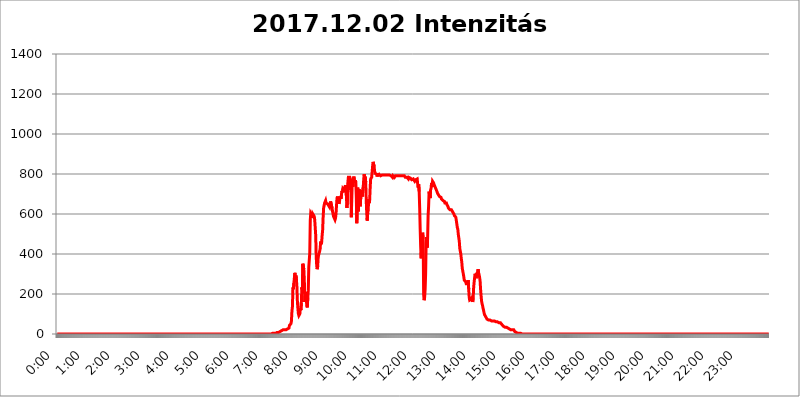
| Category | 2017.12.02 Intenzitás [W/m^2] |
|---|---|
| 0.0 | 0 |
| 0.0006944444444444445 | 0 |
| 0.001388888888888889 | 0 |
| 0.0020833333333333333 | 0 |
| 0.002777777777777778 | 0 |
| 0.003472222222222222 | 0 |
| 0.004166666666666667 | 0 |
| 0.004861111111111111 | 0 |
| 0.005555555555555556 | 0 |
| 0.0062499999999999995 | 0 |
| 0.006944444444444444 | 0 |
| 0.007638888888888889 | 0 |
| 0.008333333333333333 | 0 |
| 0.009027777777777779 | 0 |
| 0.009722222222222222 | 0 |
| 0.010416666666666666 | 0 |
| 0.011111111111111112 | 0 |
| 0.011805555555555555 | 0 |
| 0.012499999999999999 | 0 |
| 0.013194444444444444 | 0 |
| 0.013888888888888888 | 0 |
| 0.014583333333333332 | 0 |
| 0.015277777777777777 | 0 |
| 0.015972222222222224 | 0 |
| 0.016666666666666666 | 0 |
| 0.017361111111111112 | 0 |
| 0.018055555555555557 | 0 |
| 0.01875 | 0 |
| 0.019444444444444445 | 0 |
| 0.02013888888888889 | 0 |
| 0.020833333333333332 | 0 |
| 0.02152777777777778 | 0 |
| 0.022222222222222223 | 0 |
| 0.02291666666666667 | 0 |
| 0.02361111111111111 | 0 |
| 0.024305555555555556 | 0 |
| 0.024999999999999998 | 0 |
| 0.025694444444444447 | 0 |
| 0.02638888888888889 | 0 |
| 0.027083333333333334 | 0 |
| 0.027777777777777776 | 0 |
| 0.02847222222222222 | 0 |
| 0.029166666666666664 | 0 |
| 0.029861111111111113 | 0 |
| 0.030555555555555555 | 0 |
| 0.03125 | 0 |
| 0.03194444444444445 | 0 |
| 0.03263888888888889 | 0 |
| 0.03333333333333333 | 0 |
| 0.034027777777777775 | 0 |
| 0.034722222222222224 | 0 |
| 0.035416666666666666 | 0 |
| 0.036111111111111115 | 0 |
| 0.03680555555555556 | 0 |
| 0.0375 | 0 |
| 0.03819444444444444 | 0 |
| 0.03888888888888889 | 0 |
| 0.03958333333333333 | 0 |
| 0.04027777777777778 | 0 |
| 0.04097222222222222 | 0 |
| 0.041666666666666664 | 0 |
| 0.042361111111111106 | 0 |
| 0.04305555555555556 | 0 |
| 0.043750000000000004 | 0 |
| 0.044444444444444446 | 0 |
| 0.04513888888888889 | 0 |
| 0.04583333333333334 | 0 |
| 0.04652777777777778 | 0 |
| 0.04722222222222222 | 0 |
| 0.04791666666666666 | 0 |
| 0.04861111111111111 | 0 |
| 0.049305555555555554 | 0 |
| 0.049999999999999996 | 0 |
| 0.05069444444444445 | 0 |
| 0.051388888888888894 | 0 |
| 0.052083333333333336 | 0 |
| 0.05277777777777778 | 0 |
| 0.05347222222222222 | 0 |
| 0.05416666666666667 | 0 |
| 0.05486111111111111 | 0 |
| 0.05555555555555555 | 0 |
| 0.05625 | 0 |
| 0.05694444444444444 | 0 |
| 0.057638888888888885 | 0 |
| 0.05833333333333333 | 0 |
| 0.05902777777777778 | 0 |
| 0.059722222222222225 | 0 |
| 0.06041666666666667 | 0 |
| 0.061111111111111116 | 0 |
| 0.06180555555555556 | 0 |
| 0.0625 | 0 |
| 0.06319444444444444 | 0 |
| 0.06388888888888888 | 0 |
| 0.06458333333333334 | 0 |
| 0.06527777777777778 | 0 |
| 0.06597222222222222 | 0 |
| 0.06666666666666667 | 0 |
| 0.06736111111111111 | 0 |
| 0.06805555555555555 | 0 |
| 0.06874999999999999 | 0 |
| 0.06944444444444443 | 0 |
| 0.07013888888888889 | 0 |
| 0.07083333333333333 | 0 |
| 0.07152777777777779 | 0 |
| 0.07222222222222223 | 0 |
| 0.07291666666666667 | 0 |
| 0.07361111111111111 | 0 |
| 0.07430555555555556 | 0 |
| 0.075 | 0 |
| 0.07569444444444444 | 0 |
| 0.0763888888888889 | 0 |
| 0.07708333333333334 | 0 |
| 0.07777777777777778 | 0 |
| 0.07847222222222222 | 0 |
| 0.07916666666666666 | 0 |
| 0.0798611111111111 | 0 |
| 0.08055555555555556 | 0 |
| 0.08125 | 0 |
| 0.08194444444444444 | 0 |
| 0.08263888888888889 | 0 |
| 0.08333333333333333 | 0 |
| 0.08402777777777777 | 0 |
| 0.08472222222222221 | 0 |
| 0.08541666666666665 | 0 |
| 0.08611111111111112 | 0 |
| 0.08680555555555557 | 0 |
| 0.08750000000000001 | 0 |
| 0.08819444444444445 | 0 |
| 0.08888888888888889 | 0 |
| 0.08958333333333333 | 0 |
| 0.09027777777777778 | 0 |
| 0.09097222222222222 | 0 |
| 0.09166666666666667 | 0 |
| 0.09236111111111112 | 0 |
| 0.09305555555555556 | 0 |
| 0.09375 | 0 |
| 0.09444444444444444 | 0 |
| 0.09513888888888888 | 0 |
| 0.09583333333333333 | 0 |
| 0.09652777777777777 | 0 |
| 0.09722222222222222 | 0 |
| 0.09791666666666667 | 0 |
| 0.09861111111111111 | 0 |
| 0.09930555555555555 | 0 |
| 0.09999999999999999 | 0 |
| 0.10069444444444443 | 0 |
| 0.1013888888888889 | 0 |
| 0.10208333333333335 | 0 |
| 0.10277777777777779 | 0 |
| 0.10347222222222223 | 0 |
| 0.10416666666666667 | 0 |
| 0.10486111111111111 | 0 |
| 0.10555555555555556 | 0 |
| 0.10625 | 0 |
| 0.10694444444444444 | 0 |
| 0.1076388888888889 | 0 |
| 0.10833333333333334 | 0 |
| 0.10902777777777778 | 0 |
| 0.10972222222222222 | 0 |
| 0.1111111111111111 | 0 |
| 0.11180555555555556 | 0 |
| 0.11180555555555556 | 0 |
| 0.1125 | 0 |
| 0.11319444444444444 | 0 |
| 0.11388888888888889 | 0 |
| 0.11458333333333333 | 0 |
| 0.11527777777777777 | 0 |
| 0.11597222222222221 | 0 |
| 0.11666666666666665 | 0 |
| 0.1173611111111111 | 0 |
| 0.11805555555555557 | 0 |
| 0.11944444444444445 | 0 |
| 0.12013888888888889 | 0 |
| 0.12083333333333333 | 0 |
| 0.12152777777777778 | 0 |
| 0.12222222222222223 | 0 |
| 0.12291666666666667 | 0 |
| 0.12291666666666667 | 0 |
| 0.12361111111111112 | 0 |
| 0.12430555555555556 | 0 |
| 0.125 | 0 |
| 0.12569444444444444 | 0 |
| 0.12638888888888888 | 0 |
| 0.12708333333333333 | 0 |
| 0.16875 | 0 |
| 0.12847222222222224 | 0 |
| 0.12916666666666668 | 0 |
| 0.12986111111111112 | 0 |
| 0.13055555555555556 | 0 |
| 0.13125 | 0 |
| 0.13194444444444445 | 0 |
| 0.1326388888888889 | 0 |
| 0.13333333333333333 | 0 |
| 0.13402777777777777 | 0 |
| 0.13402777777777777 | 0 |
| 0.13472222222222222 | 0 |
| 0.13541666666666666 | 0 |
| 0.1361111111111111 | 0 |
| 0.13749999999999998 | 0 |
| 0.13819444444444443 | 0 |
| 0.1388888888888889 | 0 |
| 0.13958333333333334 | 0 |
| 0.14027777777777778 | 0 |
| 0.14097222222222222 | 0 |
| 0.14166666666666666 | 0 |
| 0.1423611111111111 | 0 |
| 0.14305555555555557 | 0 |
| 0.14375000000000002 | 0 |
| 0.14444444444444446 | 0 |
| 0.1451388888888889 | 0 |
| 0.1451388888888889 | 0 |
| 0.14652777777777778 | 0 |
| 0.14722222222222223 | 0 |
| 0.14791666666666667 | 0 |
| 0.1486111111111111 | 0 |
| 0.14930555555555555 | 0 |
| 0.15 | 0 |
| 0.15069444444444444 | 0 |
| 0.15138888888888888 | 0 |
| 0.15208333333333332 | 0 |
| 0.15277777777777776 | 0 |
| 0.15347222222222223 | 0 |
| 0.15416666666666667 | 0 |
| 0.15486111111111112 | 0 |
| 0.15555555555555556 | 0 |
| 0.15625 | 0 |
| 0.15694444444444444 | 0 |
| 0.15763888888888888 | 0 |
| 0.15833333333333333 | 0 |
| 0.15902777777777777 | 0 |
| 0.15972222222222224 | 0 |
| 0.16041666666666668 | 0 |
| 0.16111111111111112 | 0 |
| 0.16180555555555556 | 0 |
| 0.1625 | 0 |
| 0.16319444444444445 | 0 |
| 0.1638888888888889 | 0 |
| 0.16458333333333333 | 0 |
| 0.16527777777777777 | 0 |
| 0.16597222222222222 | 0 |
| 0.16666666666666666 | 0 |
| 0.1673611111111111 | 0 |
| 0.16805555555555554 | 0 |
| 0.16874999999999998 | 0 |
| 0.16944444444444443 | 0 |
| 0.17013888888888887 | 0 |
| 0.1708333333333333 | 0 |
| 0.17152777777777775 | 0 |
| 0.17222222222222225 | 0 |
| 0.1729166666666667 | 0 |
| 0.17361111111111113 | 0 |
| 0.17430555555555557 | 0 |
| 0.17500000000000002 | 0 |
| 0.17569444444444446 | 0 |
| 0.1763888888888889 | 0 |
| 0.17708333333333334 | 0 |
| 0.17777777777777778 | 0 |
| 0.17847222222222223 | 0 |
| 0.17916666666666667 | 0 |
| 0.1798611111111111 | 0 |
| 0.18055555555555555 | 0 |
| 0.18125 | 0 |
| 0.18194444444444444 | 0 |
| 0.1826388888888889 | 0 |
| 0.18333333333333335 | 0 |
| 0.1840277777777778 | 0 |
| 0.18472222222222223 | 0 |
| 0.18541666666666667 | 0 |
| 0.18611111111111112 | 0 |
| 0.18680555555555556 | 0 |
| 0.1875 | 0 |
| 0.18819444444444444 | 0 |
| 0.18888888888888888 | 0 |
| 0.18958333333333333 | 0 |
| 0.19027777777777777 | 0 |
| 0.1909722222222222 | 0 |
| 0.19166666666666665 | 0 |
| 0.19236111111111112 | 0 |
| 0.19305555555555554 | 0 |
| 0.19375 | 0 |
| 0.19444444444444445 | 0 |
| 0.1951388888888889 | 0 |
| 0.19583333333333333 | 0 |
| 0.19652777777777777 | 0 |
| 0.19722222222222222 | 0 |
| 0.19791666666666666 | 0 |
| 0.1986111111111111 | 0 |
| 0.19930555555555554 | 0 |
| 0.19999999999999998 | 0 |
| 0.20069444444444443 | 0 |
| 0.20138888888888887 | 0 |
| 0.2020833333333333 | 0 |
| 0.2027777777777778 | 0 |
| 0.2034722222222222 | 0 |
| 0.2041666666666667 | 0 |
| 0.20486111111111113 | 0 |
| 0.20555555555555557 | 0 |
| 0.20625000000000002 | 0 |
| 0.20694444444444446 | 0 |
| 0.2076388888888889 | 0 |
| 0.20833333333333334 | 0 |
| 0.20902777777777778 | 0 |
| 0.20972222222222223 | 0 |
| 0.21041666666666667 | 0 |
| 0.2111111111111111 | 0 |
| 0.21180555555555555 | 0 |
| 0.2125 | 0 |
| 0.21319444444444444 | 0 |
| 0.2138888888888889 | 0 |
| 0.21458333333333335 | 0 |
| 0.2152777777777778 | 0 |
| 0.21597222222222223 | 0 |
| 0.21666666666666667 | 0 |
| 0.21736111111111112 | 0 |
| 0.21805555555555556 | 0 |
| 0.21875 | 0 |
| 0.21944444444444444 | 0 |
| 0.22013888888888888 | 0 |
| 0.22083333333333333 | 0 |
| 0.22152777777777777 | 0 |
| 0.2222222222222222 | 0 |
| 0.22291666666666665 | 0 |
| 0.2236111111111111 | 0 |
| 0.22430555555555556 | 0 |
| 0.225 | 0 |
| 0.22569444444444445 | 0 |
| 0.2263888888888889 | 0 |
| 0.22708333333333333 | 0 |
| 0.22777777777777777 | 0 |
| 0.22847222222222222 | 0 |
| 0.22916666666666666 | 0 |
| 0.2298611111111111 | 0 |
| 0.23055555555555554 | 0 |
| 0.23124999999999998 | 0 |
| 0.23194444444444443 | 0 |
| 0.23263888888888887 | 0 |
| 0.2333333333333333 | 0 |
| 0.2340277777777778 | 0 |
| 0.2347222222222222 | 0 |
| 0.2354166666666667 | 0 |
| 0.23611111111111113 | 0 |
| 0.23680555555555557 | 0 |
| 0.23750000000000002 | 0 |
| 0.23819444444444446 | 0 |
| 0.2388888888888889 | 0 |
| 0.23958333333333334 | 0 |
| 0.24027777777777778 | 0 |
| 0.24097222222222223 | 0 |
| 0.24166666666666667 | 0 |
| 0.2423611111111111 | 0 |
| 0.24305555555555555 | 0 |
| 0.24375 | 0 |
| 0.24444444444444446 | 0 |
| 0.24513888888888888 | 0 |
| 0.24583333333333335 | 0 |
| 0.2465277777777778 | 0 |
| 0.24722222222222223 | 0 |
| 0.24791666666666667 | 0 |
| 0.24861111111111112 | 0 |
| 0.24930555555555556 | 0 |
| 0.25 | 0 |
| 0.25069444444444444 | 0 |
| 0.2513888888888889 | 0 |
| 0.2520833333333333 | 0 |
| 0.25277777777777777 | 0 |
| 0.2534722222222222 | 0 |
| 0.25416666666666665 | 0 |
| 0.2548611111111111 | 0 |
| 0.2555555555555556 | 0 |
| 0.25625000000000003 | 0 |
| 0.2569444444444445 | 0 |
| 0.2576388888888889 | 0 |
| 0.25833333333333336 | 0 |
| 0.2590277777777778 | 0 |
| 0.25972222222222224 | 0 |
| 0.2604166666666667 | 0 |
| 0.2611111111111111 | 0 |
| 0.26180555555555557 | 0 |
| 0.2625 | 0 |
| 0.26319444444444445 | 0 |
| 0.2638888888888889 | 0 |
| 0.26458333333333334 | 0 |
| 0.2652777777777778 | 0 |
| 0.2659722222222222 | 0 |
| 0.26666666666666666 | 0 |
| 0.2673611111111111 | 0 |
| 0.26805555555555555 | 0 |
| 0.26875 | 0 |
| 0.26944444444444443 | 0 |
| 0.2701388888888889 | 0 |
| 0.2708333333333333 | 0 |
| 0.27152777777777776 | 0 |
| 0.2722222222222222 | 0 |
| 0.27291666666666664 | 0 |
| 0.2736111111111111 | 0 |
| 0.2743055555555555 | 0 |
| 0.27499999999999997 | 0 |
| 0.27569444444444446 | 0 |
| 0.27638888888888885 | 0 |
| 0.27708333333333335 | 0 |
| 0.2777777777777778 | 0 |
| 0.27847222222222223 | 0 |
| 0.2791666666666667 | 0 |
| 0.2798611111111111 | 0 |
| 0.28055555555555556 | 0 |
| 0.28125 | 0 |
| 0.28194444444444444 | 0 |
| 0.2826388888888889 | 0 |
| 0.2833333333333333 | 0 |
| 0.28402777777777777 | 0 |
| 0.2847222222222222 | 0 |
| 0.28541666666666665 | 0 |
| 0.28611111111111115 | 0 |
| 0.28680555555555554 | 0 |
| 0.28750000000000003 | 0 |
| 0.2881944444444445 | 0 |
| 0.2888888888888889 | 0 |
| 0.28958333333333336 | 0 |
| 0.2902777777777778 | 0 |
| 0.29097222222222224 | 0 |
| 0.2916666666666667 | 0 |
| 0.2923611111111111 | 0 |
| 0.29305555555555557 | 0 |
| 0.29375 | 0 |
| 0.29444444444444445 | 0 |
| 0.2951388888888889 | 0 |
| 0.29583333333333334 | 0 |
| 0.2965277777777778 | 0 |
| 0.2972222222222222 | 0 |
| 0.29791666666666666 | 0 |
| 0.2986111111111111 | 0 |
| 0.29930555555555555 | 0 |
| 0.3 | 0 |
| 0.30069444444444443 | 3.525 |
| 0.3013888888888889 | 3.525 |
| 0.3020833333333333 | 3.525 |
| 0.30277777777777776 | 3.525 |
| 0.3034722222222222 | 3.525 |
| 0.30416666666666664 | 3.525 |
| 0.3048611111111111 | 3.525 |
| 0.3055555555555555 | 3.525 |
| 0.30624999999999997 | 3.525 |
| 0.3069444444444444 | 3.525 |
| 0.3076388888888889 | 7.887 |
| 0.30833333333333335 | 7.887 |
| 0.3090277777777778 | 7.887 |
| 0.30972222222222223 | 7.887 |
| 0.3104166666666667 | 7.887 |
| 0.3111111111111111 | 12.257 |
| 0.31180555555555556 | 12.257 |
| 0.3125 | 12.257 |
| 0.31319444444444444 | 12.257 |
| 0.3138888888888889 | 12.257 |
| 0.3145833333333333 | 16.636 |
| 0.31527777777777777 | 16.636 |
| 0.3159722222222222 | 21.024 |
| 0.31666666666666665 | 21.024 |
| 0.31736111111111115 | 21.024 |
| 0.31805555555555554 | 21.024 |
| 0.31875000000000003 | 21.024 |
| 0.3194444444444445 | 21.024 |
| 0.3201388888888889 | 21.024 |
| 0.32083333333333336 | 21.024 |
| 0.3215277777777778 | 21.024 |
| 0.32222222222222224 | 25.419 |
| 0.3229166666666667 | 25.419 |
| 0.3236111111111111 | 25.419 |
| 0.32430555555555557 | 29.823 |
| 0.325 | 29.823 |
| 0.32569444444444445 | 43.079 |
| 0.3263888888888889 | 47.511 |
| 0.32708333333333334 | 47.511 |
| 0.3277777777777778 | 51.951 |
| 0.3284722222222222 | 65.31 |
| 0.32916666666666666 | 114.716 |
| 0.3298611111111111 | 137.347 |
| 0.33055555555555555 | 233 |
| 0.33125 | 223.873 |
| 0.33194444444444443 | 255.813 |
| 0.3326388888888889 | 283.156 |
| 0.3333333333333333 | 305.898 |
| 0.3340277777777778 | 274.047 |
| 0.3347222222222222 | 292.259 |
| 0.3354166666666667 | 274.047 |
| 0.3361111111111111 | 237.564 |
| 0.3368055555555556 | 164.605 |
| 0.33749999999999997 | 128.284 |
| 0.33819444444444446 | 101.184 |
| 0.33888888888888885 | 92.184 |
| 0.33958333333333335 | 92.184 |
| 0.34027777777777773 | 101.184 |
| 0.34097222222222223 | 128.284 |
| 0.3416666666666666 | 119.235 |
| 0.3423611111111111 | 155.509 |
| 0.3430555555555555 | 233 |
| 0.34375 | 223.873 |
| 0.3444444444444445 | 351.198 |
| 0.3451388888888889 | 351.198 |
| 0.3458333333333334 | 324.052 |
| 0.34652777777777777 | 269.49 |
| 0.34722222222222227 | 160.056 |
| 0.34791666666666665 | 210.182 |
| 0.34861111111111115 | 201.058 |
| 0.34930555555555554 | 173.709 |
| 0.35000000000000003 | 141.884 |
| 0.3506944444444444 | 132.814 |
| 0.3513888888888889 | 182.82 |
| 0.3520833333333333 | 219.309 |
| 0.3527777777777778 | 333.113 |
| 0.3534722222222222 | 337.639 |
| 0.3541666666666667 | 405.108 |
| 0.3548611111111111 | 566.793 |
| 0.35555555555555557 | 604.864 |
| 0.35625 | 604.864 |
| 0.35694444444444445 | 596.45 |
| 0.3576388888888889 | 579.542 |
| 0.35833333333333334 | 600.661 |
| 0.3590277777777778 | 604.864 |
| 0.3597222222222222 | 600.661 |
| 0.36041666666666666 | 588.009 |
| 0.3611111111111111 | 571.049 |
| 0.36180555555555555 | 575.299 |
| 0.3625 | 493.475 |
| 0.36319444444444443 | 387.202 |
| 0.3638888888888889 | 342.162 |
| 0.3645833333333333 | 324.052 |
| 0.3652777777777778 | 337.639 |
| 0.3659722222222222 | 382.715 |
| 0.3666666666666667 | 396.164 |
| 0.3673611111111111 | 405.108 |
| 0.3680555555555556 | 414.035 |
| 0.36874999999999997 | 427.39 |
| 0.36944444444444446 | 462.786 |
| 0.37013888888888885 | 449.551 |
| 0.37083333333333335 | 458.38 |
| 0.37152777777777773 | 493.475 |
| 0.37222222222222223 | 519.555 |
| 0.3729166666666666 | 583.779 |
| 0.3736111111111111 | 629.948 |
| 0.3743055555555555 | 642.4 |
| 0.375 | 654.791 |
| 0.3756944444444445 | 658.909 |
| 0.3763888888888889 | 667.123 |
| 0.3770833333333334 | 654.791 |
| 0.37777777777777777 | 650.667 |
| 0.37847222222222227 | 654.791 |
| 0.37916666666666665 | 650.667 |
| 0.37986111111111115 | 646.537 |
| 0.38055555555555554 | 642.4 |
| 0.38125000000000003 | 638.256 |
| 0.3819444444444444 | 634.105 |
| 0.3826388888888889 | 646.537 |
| 0.3833333333333333 | 663.019 |
| 0.3840277777777778 | 667.123 |
| 0.3847222222222222 | 663.019 |
| 0.3854166666666667 | 629.948 |
| 0.3861111111111111 | 613.252 |
| 0.38680555555555557 | 600.661 |
| 0.3875 | 588.009 |
| 0.38819444444444445 | 588.009 |
| 0.3888888888888889 | 588.009 |
| 0.38958333333333334 | 571.049 |
| 0.3902777777777778 | 579.542 |
| 0.3909722222222222 | 600.661 |
| 0.39166666666666666 | 642.4 |
| 0.3923611111111111 | 679.395 |
| 0.39305555555555555 | 687.544 |
| 0.39375 | 683.473 |
| 0.39444444444444443 | 658.909 |
| 0.3951388888888889 | 650.667 |
| 0.3958333333333333 | 663.019 |
| 0.3965277777777778 | 679.395 |
| 0.3972222222222222 | 687.544 |
| 0.3979166666666667 | 675.311 |
| 0.3986111111111111 | 695.666 |
| 0.3993055555555556 | 715.858 |
| 0.39999999999999997 | 707.8 |
| 0.40069444444444446 | 727.896 |
| 0.40138888888888885 | 727.896 |
| 0.40208333333333335 | 727.896 |
| 0.40277777777777773 | 719.877 |
| 0.40347222222222223 | 735.89 |
| 0.4041666666666666 | 743.859 |
| 0.4048611111111111 | 743.859 |
| 0.4055555555555555 | 691.608 |
| 0.40625 | 629.948 |
| 0.4069444444444445 | 663.019 |
| 0.4076388888888889 | 759.723 |
| 0.4083333333333334 | 783.342 |
| 0.40902777777777777 | 787.258 |
| 0.40972222222222227 | 787.258 |
| 0.41041666666666665 | 783.342 |
| 0.41111111111111115 | 775.492 |
| 0.41180555555555554 | 723.889 |
| 0.41250000000000003 | 583.779 |
| 0.4131944444444444 | 735.89 |
| 0.4138888888888889 | 775.492 |
| 0.4145833333333333 | 735.89 |
| 0.4152777777777778 | 775.492 |
| 0.4159722222222222 | 787.258 |
| 0.4166666666666667 | 791.169 |
| 0.4173611111111111 | 755.766 |
| 0.41805555555555557 | 767.62 |
| 0.41875 | 759.723 |
| 0.41944444444444445 | 683.473 |
| 0.4201388888888889 | 553.986 |
| 0.42083333333333334 | 667.123 |
| 0.4215277777777778 | 731.896 |
| 0.4222222222222222 | 613.252 |
| 0.42291666666666666 | 683.473 |
| 0.4236111111111111 | 723.889 |
| 0.42430555555555555 | 650.667 |
| 0.425 | 638.256 |
| 0.42569444444444443 | 687.544 |
| 0.4263888888888889 | 699.717 |
| 0.4270833333333333 | 719.877 |
| 0.4277777777777778 | 687.544 |
| 0.4284722222222222 | 683.473 |
| 0.4291666666666667 | 735.89 |
| 0.4298611111111111 | 775.492 |
| 0.4305555555555556 | 798.974 |
| 0.43124999999999997 | 779.42 |
| 0.43194444444444446 | 787.258 |
| 0.43263888888888885 | 759.723 |
| 0.43333333333333335 | 671.22 |
| 0.43402777777777773 | 609.062 |
| 0.43472222222222223 | 566.793 |
| 0.4354166666666666 | 604.864 |
| 0.4361111111111111 | 617.436 |
| 0.4368055555555555 | 675.311 |
| 0.4375 | 654.791 |
| 0.4381944444444445 | 671.22 |
| 0.4388888888888889 | 731.896 |
| 0.4395833333333334 | 775.492 |
| 0.44027777777777777 | 771.559 |
| 0.44097222222222227 | 783.342 |
| 0.44166666666666665 | 810.641 |
| 0.44236111111111115 | 841.526 |
| 0.44305555555555554 | 860.676 |
| 0.44375000000000003 | 860.676 |
| 0.4444444444444444 | 837.682 |
| 0.4451388888888889 | 814.519 |
| 0.4458333333333333 | 802.868 |
| 0.4465277777777778 | 798.974 |
| 0.4472222222222222 | 802.868 |
| 0.4479166666666667 | 798.974 |
| 0.4486111111111111 | 787.258 |
| 0.44930555555555557 | 795.074 |
| 0.45 | 795.074 |
| 0.45069444444444445 | 798.974 |
| 0.4513888888888889 | 798.974 |
| 0.45208333333333334 | 795.074 |
| 0.4527777777777778 | 795.074 |
| 0.4534722222222222 | 791.169 |
| 0.45416666666666666 | 795.074 |
| 0.4548611111111111 | 795.074 |
| 0.45555555555555555 | 795.074 |
| 0.45625 | 795.074 |
| 0.45694444444444443 | 795.074 |
| 0.4576388888888889 | 795.074 |
| 0.4583333333333333 | 795.074 |
| 0.4590277777777778 | 795.074 |
| 0.4597222222222222 | 795.074 |
| 0.4604166666666667 | 795.074 |
| 0.4611111111111111 | 795.074 |
| 0.4618055555555556 | 795.074 |
| 0.46249999999999997 | 795.074 |
| 0.46319444444444446 | 795.074 |
| 0.46388888888888885 | 795.074 |
| 0.46458333333333335 | 795.074 |
| 0.46527777777777773 | 795.074 |
| 0.46597222222222223 | 795.074 |
| 0.4666666666666666 | 795.074 |
| 0.4673611111111111 | 795.074 |
| 0.4680555555555555 | 791.169 |
| 0.46875 | 791.169 |
| 0.4694444444444445 | 791.169 |
| 0.4701388888888889 | 783.342 |
| 0.4708333333333334 | 791.169 |
| 0.47152777777777777 | 791.169 |
| 0.47222222222222227 | 787.258 |
| 0.47291666666666665 | 783.342 |
| 0.47361111111111115 | 787.258 |
| 0.47430555555555554 | 791.169 |
| 0.47500000000000003 | 791.169 |
| 0.4756944444444444 | 791.169 |
| 0.4763888888888889 | 791.169 |
| 0.4770833333333333 | 787.258 |
| 0.4777777777777778 | 791.169 |
| 0.4784722222222222 | 791.169 |
| 0.4791666666666667 | 791.169 |
| 0.4798611111111111 | 791.169 |
| 0.48055555555555557 | 791.169 |
| 0.48125 | 795.074 |
| 0.48194444444444445 | 791.169 |
| 0.4826388888888889 | 791.169 |
| 0.48333333333333334 | 795.074 |
| 0.4840277777777778 | 791.169 |
| 0.4847222222222222 | 791.169 |
| 0.48541666666666666 | 787.258 |
| 0.4861111111111111 | 791.169 |
| 0.48680555555555555 | 791.169 |
| 0.4875 | 787.258 |
| 0.48819444444444443 | 783.342 |
| 0.4888888888888889 | 787.258 |
| 0.4895833333333333 | 783.342 |
| 0.4902777777777778 | 783.342 |
| 0.4909722222222222 | 783.342 |
| 0.4916666666666667 | 783.342 |
| 0.4923611111111111 | 775.492 |
| 0.4930555555555556 | 783.342 |
| 0.49374999999999997 | 779.42 |
| 0.49444444444444446 | 779.42 |
| 0.49513888888888885 | 779.42 |
| 0.49583333333333335 | 779.42 |
| 0.49652777777777773 | 779.42 |
| 0.49722222222222223 | 771.559 |
| 0.4979166666666666 | 775.492 |
| 0.4986111111111111 | 771.559 |
| 0.4993055555555555 | 775.492 |
| 0.5 | 775.492 |
| 0.5006944444444444 | 775.492 |
| 0.5013888888888889 | 763.674 |
| 0.5020833333333333 | 763.674 |
| 0.5027777777777778 | 771.559 |
| 0.5034722222222222 | 767.62 |
| 0.5041666666666667 | 767.62 |
| 0.5048611111111111 | 775.492 |
| 0.5055555555555555 | 747.834 |
| 0.50625 | 731.896 |
| 0.5069444444444444 | 747.834 |
| 0.5076388888888889 | 711.832 |
| 0.5083333333333333 | 629.948 |
| 0.5090277777777777 | 523.88 |
| 0.5097222222222222 | 436.27 |
| 0.5104166666666666 | 378.224 |
| 0.5111111111111112 | 449.551 |
| 0.5118055555555555 | 453.968 |
| 0.5125000000000001 | 506.542 |
| 0.5131944444444444 | 475.972 |
| 0.513888888888889 | 196.497 |
| 0.5145833333333333 | 169.156 |
| 0.5152777777777778 | 182.82 |
| 0.5159722222222222 | 223.873 |
| 0.5166666666666667 | 301.354 |
| 0.517361111111111 | 453.968 |
| 0.5180555555555556 | 484.735 |
| 0.5187499999999999 | 431.833 |
| 0.5194444444444445 | 475.972 |
| 0.5201388888888888 | 592.233 |
| 0.5208333333333334 | 638.256 |
| 0.5215277777777778 | 711.832 |
| 0.5222222222222223 | 711.832 |
| 0.5229166666666667 | 679.395 |
| 0.5236111111111111 | 719.877 |
| 0.5243055555555556 | 727.896 |
| 0.525 | 755.766 |
| 0.5256944444444445 | 735.89 |
| 0.5263888888888889 | 763.674 |
| 0.5270833333333333 | 763.674 |
| 0.5277777777777778 | 755.766 |
| 0.5284722222222222 | 747.834 |
| 0.5291666666666667 | 743.859 |
| 0.5298611111111111 | 735.89 |
| 0.5305555555555556 | 731.896 |
| 0.53125 | 723.889 |
| 0.5319444444444444 | 719.877 |
| 0.5326388888888889 | 711.832 |
| 0.5333333333333333 | 703.762 |
| 0.5340277777777778 | 703.762 |
| 0.5347222222222222 | 695.666 |
| 0.5354166666666667 | 691.608 |
| 0.5361111111111111 | 687.544 |
| 0.5368055555555555 | 687.544 |
| 0.5375 | 683.473 |
| 0.5381944444444444 | 683.473 |
| 0.5388888888888889 | 675.311 |
| 0.5395833333333333 | 675.311 |
| 0.5402777777777777 | 671.22 |
| 0.5409722222222222 | 667.123 |
| 0.5416666666666666 | 667.123 |
| 0.5423611111111112 | 667.123 |
| 0.5430555555555555 | 663.019 |
| 0.5437500000000001 | 654.791 |
| 0.5444444444444444 | 654.791 |
| 0.545138888888889 | 654.791 |
| 0.5458333333333333 | 654.791 |
| 0.5465277777777778 | 646.537 |
| 0.5472222222222222 | 642.4 |
| 0.5479166666666667 | 638.256 |
| 0.548611111111111 | 629.948 |
| 0.5493055555555556 | 634.105 |
| 0.5499999999999999 | 634.105 |
| 0.5506944444444445 | 621.613 |
| 0.5513888888888888 | 625.784 |
| 0.5520833333333334 | 625.784 |
| 0.5527777777777778 | 621.613 |
| 0.5534722222222223 | 621.613 |
| 0.5541666666666667 | 613.252 |
| 0.5548611111111111 | 609.062 |
| 0.5555555555555556 | 609.062 |
| 0.55625 | 600.661 |
| 0.5569444444444445 | 592.233 |
| 0.5576388888888889 | 592.233 |
| 0.5583333333333333 | 588.009 |
| 0.5590277777777778 | 583.779 |
| 0.5597222222222222 | 566.793 |
| 0.5604166666666667 | 562.53 |
| 0.5611111111111111 | 532.513 |
| 0.5618055555555556 | 523.88 |
| 0.5625 | 497.836 |
| 0.5631944444444444 | 497.836 |
| 0.5638888888888889 | 462.786 |
| 0.5645833333333333 | 427.39 |
| 0.5652777777777778 | 427.39 |
| 0.5659722222222222 | 400.638 |
| 0.5666666666666667 | 378.224 |
| 0.5673611111111111 | 360.221 |
| 0.5680555555555555 | 328.584 |
| 0.56875 | 333.113 |
| 0.5694444444444444 | 301.354 |
| 0.5701388888888889 | 287.709 |
| 0.5708333333333333 | 269.49 |
| 0.5715277777777777 | 274.047 |
| 0.5722222222222222 | 269.49 |
| 0.5729166666666666 | 260.373 |
| 0.5736111111111112 | 251.251 |
| 0.5743055555555555 | 251.251 |
| 0.5750000000000001 | 246.689 |
| 0.5756944444444444 | 251.251 |
| 0.576388888888889 | 269.49 |
| 0.5770833333333333 | 223.873 |
| 0.5777777777777778 | 182.82 |
| 0.5784722222222222 | 169.156 |
| 0.5791666666666667 | 169.156 |
| 0.579861111111111 | 169.156 |
| 0.5805555555555556 | 173.709 |
| 0.5812499999999999 | 178.264 |
| 0.5819444444444445 | 182.82 |
| 0.5826388888888888 | 160.056 |
| 0.5833333333333334 | 178.264 |
| 0.5840277777777778 | 233 |
| 0.5847222222222223 | 260.373 |
| 0.5854166666666667 | 283.156 |
| 0.5861111111111111 | 301.354 |
| 0.5868055555555556 | 292.259 |
| 0.5875 | 278.603 |
| 0.5881944444444445 | 301.354 |
| 0.5888888888888889 | 305.898 |
| 0.5895833333333333 | 310.44 |
| 0.5902777777777778 | 324.052 |
| 0.5909722222222222 | 305.898 |
| 0.5916666666666667 | 296.808 |
| 0.5923611111111111 | 283.156 |
| 0.5930555555555556 | 264.932 |
| 0.59375 | 223.873 |
| 0.5944444444444444 | 191.937 |
| 0.5951388888888889 | 164.605 |
| 0.5958333333333333 | 150.964 |
| 0.5965277777777778 | 141.884 |
| 0.5972222222222222 | 128.284 |
| 0.5979166666666667 | 119.235 |
| 0.5986111111111111 | 105.69 |
| 0.5993055555555555 | 96.682 |
| 0.6 | 92.184 |
| 0.6006944444444444 | 87.692 |
| 0.6013888888888889 | 83.205 |
| 0.6020833333333333 | 83.205 |
| 0.6027777777777777 | 74.246 |
| 0.6034722222222222 | 74.246 |
| 0.6041666666666666 | 74.246 |
| 0.6048611111111112 | 69.775 |
| 0.6055555555555555 | 69.775 |
| 0.6062500000000001 | 69.775 |
| 0.6069444444444444 | 69.775 |
| 0.607638888888889 | 65.31 |
| 0.6083333333333333 | 65.31 |
| 0.6090277777777778 | 65.31 |
| 0.6097222222222222 | 65.31 |
| 0.6104166666666667 | 65.31 |
| 0.611111111111111 | 65.31 |
| 0.6118055555555556 | 65.31 |
| 0.6124999999999999 | 60.85 |
| 0.6131944444444445 | 65.31 |
| 0.6138888888888888 | 60.85 |
| 0.6145833333333334 | 60.85 |
| 0.6152777777777778 | 60.85 |
| 0.6159722222222223 | 60.85 |
| 0.6166666666666667 | 60.85 |
| 0.6173611111111111 | 60.85 |
| 0.6180555555555556 | 56.398 |
| 0.61875 | 56.398 |
| 0.6194444444444445 | 56.398 |
| 0.6201388888888889 | 56.398 |
| 0.6208333333333333 | 56.398 |
| 0.6215277777777778 | 56.398 |
| 0.6222222222222222 | 51.951 |
| 0.6229166666666667 | 51.951 |
| 0.6236111111111111 | 47.511 |
| 0.6243055555555556 | 43.079 |
| 0.625 | 43.079 |
| 0.6256944444444444 | 38.653 |
| 0.6263888888888889 | 38.653 |
| 0.6270833333333333 | 34.234 |
| 0.6277777777777778 | 34.234 |
| 0.6284722222222222 | 34.234 |
| 0.6291666666666667 | 29.823 |
| 0.6298611111111111 | 34.234 |
| 0.6305555555555555 | 29.823 |
| 0.63125 | 29.823 |
| 0.6319444444444444 | 29.823 |
| 0.6326388888888889 | 29.823 |
| 0.6333333333333333 | 25.419 |
| 0.6340277777777777 | 25.419 |
| 0.6347222222222222 | 21.024 |
| 0.6354166666666666 | 21.024 |
| 0.6361111111111112 | 21.024 |
| 0.6368055555555555 | 21.024 |
| 0.6375000000000001 | 21.024 |
| 0.6381944444444444 | 21.024 |
| 0.638888888888889 | 21.024 |
| 0.6395833333333333 | 21.024 |
| 0.6402777777777778 | 21.024 |
| 0.6409722222222222 | 16.636 |
| 0.6416666666666667 | 12.257 |
| 0.642361111111111 | 12.257 |
| 0.6430555555555556 | 7.887 |
| 0.6437499999999999 | 7.887 |
| 0.6444444444444445 | 3.525 |
| 0.6451388888888888 | 3.525 |
| 0.6458333333333334 | 3.525 |
| 0.6465277777777778 | 3.525 |
| 0.6472222222222223 | 3.525 |
| 0.6479166666666667 | 3.525 |
| 0.6486111111111111 | 3.525 |
| 0.6493055555555556 | 3.525 |
| 0.65 | 3.525 |
| 0.6506944444444445 | 3.525 |
| 0.6513888888888889 | 3.525 |
| 0.6520833333333333 | 0 |
| 0.6527777777777778 | 3.525 |
| 0.6534722222222222 | 0 |
| 0.6541666666666667 | 0 |
| 0.6548611111111111 | 0 |
| 0.6555555555555556 | 0 |
| 0.65625 | 0 |
| 0.6569444444444444 | 0 |
| 0.6576388888888889 | 0 |
| 0.6583333333333333 | 0 |
| 0.6590277777777778 | 0 |
| 0.6597222222222222 | 0 |
| 0.6604166666666667 | 0 |
| 0.6611111111111111 | 0 |
| 0.6618055555555555 | 0 |
| 0.6625 | 0 |
| 0.6631944444444444 | 0 |
| 0.6638888888888889 | 0 |
| 0.6645833333333333 | 0 |
| 0.6652777777777777 | 0 |
| 0.6659722222222222 | 0 |
| 0.6666666666666666 | 0 |
| 0.6673611111111111 | 0 |
| 0.6680555555555556 | 0 |
| 0.6687500000000001 | 0 |
| 0.6694444444444444 | 0 |
| 0.6701388888888888 | 0 |
| 0.6708333333333334 | 0 |
| 0.6715277777777778 | 0 |
| 0.6722222222222222 | 0 |
| 0.6729166666666666 | 0 |
| 0.6736111111111112 | 0 |
| 0.6743055555555556 | 0 |
| 0.6749999999999999 | 0 |
| 0.6756944444444444 | 0 |
| 0.6763888888888889 | 0 |
| 0.6770833333333334 | 0 |
| 0.6777777777777777 | 0 |
| 0.6784722222222223 | 0 |
| 0.6791666666666667 | 0 |
| 0.6798611111111111 | 0 |
| 0.6805555555555555 | 0 |
| 0.68125 | 0 |
| 0.6819444444444445 | 0 |
| 0.6826388888888889 | 0 |
| 0.6833333333333332 | 0 |
| 0.6840277777777778 | 0 |
| 0.6847222222222222 | 0 |
| 0.6854166666666667 | 0 |
| 0.686111111111111 | 0 |
| 0.6868055555555556 | 0 |
| 0.6875 | 0 |
| 0.6881944444444444 | 0 |
| 0.688888888888889 | 0 |
| 0.6895833333333333 | 0 |
| 0.6902777777777778 | 0 |
| 0.6909722222222222 | 0 |
| 0.6916666666666668 | 0 |
| 0.6923611111111111 | 0 |
| 0.6930555555555555 | 0 |
| 0.69375 | 0 |
| 0.6944444444444445 | 0 |
| 0.6951388888888889 | 0 |
| 0.6958333333333333 | 0 |
| 0.6965277777777777 | 0 |
| 0.6972222222222223 | 0 |
| 0.6979166666666666 | 0 |
| 0.6986111111111111 | 0 |
| 0.6993055555555556 | 0 |
| 0.7000000000000001 | 0 |
| 0.7006944444444444 | 0 |
| 0.7013888888888888 | 0 |
| 0.7020833333333334 | 0 |
| 0.7027777777777778 | 0 |
| 0.7034722222222222 | 0 |
| 0.7041666666666666 | 0 |
| 0.7048611111111112 | 0 |
| 0.7055555555555556 | 0 |
| 0.7062499999999999 | 0 |
| 0.7069444444444444 | 0 |
| 0.7076388888888889 | 0 |
| 0.7083333333333334 | 0 |
| 0.7090277777777777 | 0 |
| 0.7097222222222223 | 0 |
| 0.7104166666666667 | 0 |
| 0.7111111111111111 | 0 |
| 0.7118055555555555 | 0 |
| 0.7125 | 0 |
| 0.7131944444444445 | 0 |
| 0.7138888888888889 | 0 |
| 0.7145833333333332 | 0 |
| 0.7152777777777778 | 0 |
| 0.7159722222222222 | 0 |
| 0.7166666666666667 | 0 |
| 0.717361111111111 | 0 |
| 0.7180555555555556 | 0 |
| 0.71875 | 0 |
| 0.7194444444444444 | 0 |
| 0.720138888888889 | 0 |
| 0.7208333333333333 | 0 |
| 0.7215277777777778 | 0 |
| 0.7222222222222222 | 0 |
| 0.7229166666666668 | 0 |
| 0.7236111111111111 | 0 |
| 0.7243055555555555 | 0 |
| 0.725 | 0 |
| 0.7256944444444445 | 0 |
| 0.7263888888888889 | 0 |
| 0.7270833333333333 | 0 |
| 0.7277777777777777 | 0 |
| 0.7284722222222223 | 0 |
| 0.7291666666666666 | 0 |
| 0.7298611111111111 | 0 |
| 0.7305555555555556 | 0 |
| 0.7312500000000001 | 0 |
| 0.7319444444444444 | 0 |
| 0.7326388888888888 | 0 |
| 0.7333333333333334 | 0 |
| 0.7340277777777778 | 0 |
| 0.7347222222222222 | 0 |
| 0.7354166666666666 | 0 |
| 0.7361111111111112 | 0 |
| 0.7368055555555556 | 0 |
| 0.7374999999999999 | 0 |
| 0.7381944444444444 | 0 |
| 0.7388888888888889 | 0 |
| 0.7395833333333334 | 0 |
| 0.7402777777777777 | 0 |
| 0.7409722222222223 | 0 |
| 0.7416666666666667 | 0 |
| 0.7423611111111111 | 0 |
| 0.7430555555555555 | 0 |
| 0.74375 | 0 |
| 0.7444444444444445 | 0 |
| 0.7451388888888889 | 0 |
| 0.7458333333333332 | 0 |
| 0.7465277777777778 | 0 |
| 0.7472222222222222 | 0 |
| 0.7479166666666667 | 0 |
| 0.748611111111111 | 0 |
| 0.7493055555555556 | 0 |
| 0.75 | 0 |
| 0.7506944444444444 | 0 |
| 0.751388888888889 | 0 |
| 0.7520833333333333 | 0 |
| 0.7527777777777778 | 0 |
| 0.7534722222222222 | 0 |
| 0.7541666666666668 | 0 |
| 0.7548611111111111 | 0 |
| 0.7555555555555555 | 0 |
| 0.75625 | 0 |
| 0.7569444444444445 | 0 |
| 0.7576388888888889 | 0 |
| 0.7583333333333333 | 0 |
| 0.7590277777777777 | 0 |
| 0.7597222222222223 | 0 |
| 0.7604166666666666 | 0 |
| 0.7611111111111111 | 0 |
| 0.7618055555555556 | 0 |
| 0.7625000000000001 | 0 |
| 0.7631944444444444 | 0 |
| 0.7638888888888888 | 0 |
| 0.7645833333333334 | 0 |
| 0.7652777777777778 | 0 |
| 0.7659722222222222 | 0 |
| 0.7666666666666666 | 0 |
| 0.7673611111111112 | 0 |
| 0.7680555555555556 | 0 |
| 0.7687499999999999 | 0 |
| 0.7694444444444444 | 0 |
| 0.7701388888888889 | 0 |
| 0.7708333333333334 | 0 |
| 0.7715277777777777 | 0 |
| 0.7722222222222223 | 0 |
| 0.7729166666666667 | 0 |
| 0.7736111111111111 | 0 |
| 0.7743055555555555 | 0 |
| 0.775 | 0 |
| 0.7756944444444445 | 0 |
| 0.7763888888888889 | 0 |
| 0.7770833333333332 | 0 |
| 0.7777777777777778 | 0 |
| 0.7784722222222222 | 0 |
| 0.7791666666666667 | 0 |
| 0.779861111111111 | 0 |
| 0.7805555555555556 | 0 |
| 0.78125 | 0 |
| 0.7819444444444444 | 0 |
| 0.782638888888889 | 0 |
| 0.7833333333333333 | 0 |
| 0.7840277777777778 | 0 |
| 0.7847222222222222 | 0 |
| 0.7854166666666668 | 0 |
| 0.7861111111111111 | 0 |
| 0.7868055555555555 | 0 |
| 0.7875 | 0 |
| 0.7881944444444445 | 0 |
| 0.7888888888888889 | 0 |
| 0.7895833333333333 | 0 |
| 0.7902777777777777 | 0 |
| 0.7909722222222223 | 0 |
| 0.7916666666666666 | 0 |
| 0.7923611111111111 | 0 |
| 0.7930555555555556 | 0 |
| 0.7937500000000001 | 0 |
| 0.7944444444444444 | 0 |
| 0.7951388888888888 | 0 |
| 0.7958333333333334 | 0 |
| 0.7965277777777778 | 0 |
| 0.7972222222222222 | 0 |
| 0.7979166666666666 | 0 |
| 0.7986111111111112 | 0 |
| 0.7993055555555556 | 0 |
| 0.7999999999999999 | 0 |
| 0.8006944444444444 | 0 |
| 0.8013888888888889 | 0 |
| 0.8020833333333334 | 0 |
| 0.8027777777777777 | 0 |
| 0.8034722222222223 | 0 |
| 0.8041666666666667 | 0 |
| 0.8048611111111111 | 0 |
| 0.8055555555555555 | 0 |
| 0.80625 | 0 |
| 0.8069444444444445 | 0 |
| 0.8076388888888889 | 0 |
| 0.8083333333333332 | 0 |
| 0.8090277777777778 | 0 |
| 0.8097222222222222 | 0 |
| 0.8104166666666667 | 0 |
| 0.811111111111111 | 0 |
| 0.8118055555555556 | 0 |
| 0.8125 | 0 |
| 0.8131944444444444 | 0 |
| 0.813888888888889 | 0 |
| 0.8145833333333333 | 0 |
| 0.8152777777777778 | 0 |
| 0.8159722222222222 | 0 |
| 0.8166666666666668 | 0 |
| 0.8173611111111111 | 0 |
| 0.8180555555555555 | 0 |
| 0.81875 | 0 |
| 0.8194444444444445 | 0 |
| 0.8201388888888889 | 0 |
| 0.8208333333333333 | 0 |
| 0.8215277777777777 | 0 |
| 0.8222222222222223 | 0 |
| 0.8229166666666666 | 0 |
| 0.8236111111111111 | 0 |
| 0.8243055555555556 | 0 |
| 0.8250000000000001 | 0 |
| 0.8256944444444444 | 0 |
| 0.8263888888888888 | 0 |
| 0.8270833333333334 | 0 |
| 0.8277777777777778 | 0 |
| 0.8284722222222222 | 0 |
| 0.8291666666666666 | 0 |
| 0.8298611111111112 | 0 |
| 0.8305555555555556 | 0 |
| 0.8312499999999999 | 0 |
| 0.8319444444444444 | 0 |
| 0.8326388888888889 | 0 |
| 0.8333333333333334 | 0 |
| 0.8340277777777777 | 0 |
| 0.8347222222222223 | 0 |
| 0.8354166666666667 | 0 |
| 0.8361111111111111 | 0 |
| 0.8368055555555555 | 0 |
| 0.8375 | 0 |
| 0.8381944444444445 | 0 |
| 0.8388888888888889 | 0 |
| 0.8395833333333332 | 0 |
| 0.8402777777777778 | 0 |
| 0.8409722222222222 | 0 |
| 0.8416666666666667 | 0 |
| 0.842361111111111 | 0 |
| 0.8430555555555556 | 0 |
| 0.84375 | 0 |
| 0.8444444444444444 | 0 |
| 0.845138888888889 | 0 |
| 0.8458333333333333 | 0 |
| 0.8465277777777778 | 0 |
| 0.8472222222222222 | 0 |
| 0.8479166666666668 | 0 |
| 0.8486111111111111 | 0 |
| 0.8493055555555555 | 0 |
| 0.85 | 0 |
| 0.8506944444444445 | 0 |
| 0.8513888888888889 | 0 |
| 0.8520833333333333 | 0 |
| 0.8527777777777777 | 0 |
| 0.8534722222222223 | 0 |
| 0.8541666666666666 | 0 |
| 0.8548611111111111 | 0 |
| 0.8555555555555556 | 0 |
| 0.8562500000000001 | 0 |
| 0.8569444444444444 | 0 |
| 0.8576388888888888 | 0 |
| 0.8583333333333334 | 0 |
| 0.8590277777777778 | 0 |
| 0.8597222222222222 | 0 |
| 0.8604166666666666 | 0 |
| 0.8611111111111112 | 0 |
| 0.8618055555555556 | 0 |
| 0.8624999999999999 | 0 |
| 0.8631944444444444 | 0 |
| 0.8638888888888889 | 0 |
| 0.8645833333333334 | 0 |
| 0.8652777777777777 | 0 |
| 0.8659722222222223 | 0 |
| 0.8666666666666667 | 0 |
| 0.8673611111111111 | 0 |
| 0.8680555555555555 | 0 |
| 0.86875 | 0 |
| 0.8694444444444445 | 0 |
| 0.8701388888888889 | 0 |
| 0.8708333333333332 | 0 |
| 0.8715277777777778 | 0 |
| 0.8722222222222222 | 0 |
| 0.8729166666666667 | 0 |
| 0.873611111111111 | 0 |
| 0.8743055555555556 | 0 |
| 0.875 | 0 |
| 0.8756944444444444 | 0 |
| 0.876388888888889 | 0 |
| 0.8770833333333333 | 0 |
| 0.8777777777777778 | 0 |
| 0.8784722222222222 | 0 |
| 0.8791666666666668 | 0 |
| 0.8798611111111111 | 0 |
| 0.8805555555555555 | 0 |
| 0.88125 | 0 |
| 0.8819444444444445 | 0 |
| 0.8826388888888889 | 0 |
| 0.8833333333333333 | 0 |
| 0.8840277777777777 | 0 |
| 0.8847222222222223 | 0 |
| 0.8854166666666666 | 0 |
| 0.8861111111111111 | 0 |
| 0.8868055555555556 | 0 |
| 0.8875000000000001 | 0 |
| 0.8881944444444444 | 0 |
| 0.8888888888888888 | 0 |
| 0.8895833333333334 | 0 |
| 0.8902777777777778 | 0 |
| 0.8909722222222222 | 0 |
| 0.8916666666666666 | 0 |
| 0.8923611111111112 | 0 |
| 0.8930555555555556 | 0 |
| 0.8937499999999999 | 0 |
| 0.8944444444444444 | 0 |
| 0.8951388888888889 | 0 |
| 0.8958333333333334 | 0 |
| 0.8965277777777777 | 0 |
| 0.8972222222222223 | 0 |
| 0.8979166666666667 | 0 |
| 0.8986111111111111 | 0 |
| 0.8993055555555555 | 0 |
| 0.9 | 0 |
| 0.9006944444444445 | 0 |
| 0.9013888888888889 | 0 |
| 0.9020833333333332 | 0 |
| 0.9027777777777778 | 0 |
| 0.9034722222222222 | 0 |
| 0.9041666666666667 | 0 |
| 0.904861111111111 | 0 |
| 0.9055555555555556 | 0 |
| 0.90625 | 0 |
| 0.9069444444444444 | 0 |
| 0.907638888888889 | 0 |
| 0.9083333333333333 | 0 |
| 0.9090277777777778 | 0 |
| 0.9097222222222222 | 0 |
| 0.9104166666666668 | 0 |
| 0.9111111111111111 | 0 |
| 0.9118055555555555 | 0 |
| 0.9125 | 0 |
| 0.9131944444444445 | 0 |
| 0.9138888888888889 | 0 |
| 0.9145833333333333 | 0 |
| 0.9152777777777777 | 0 |
| 0.9159722222222223 | 0 |
| 0.9166666666666666 | 0 |
| 0.9173611111111111 | 0 |
| 0.9180555555555556 | 0 |
| 0.9187500000000001 | 0 |
| 0.9194444444444444 | 0 |
| 0.9201388888888888 | 0 |
| 0.9208333333333334 | 0 |
| 0.9215277777777778 | 0 |
| 0.9222222222222222 | 0 |
| 0.9229166666666666 | 0 |
| 0.9236111111111112 | 0 |
| 0.9243055555555556 | 0 |
| 0.9249999999999999 | 0 |
| 0.9256944444444444 | 0 |
| 0.9263888888888889 | 0 |
| 0.9270833333333334 | 0 |
| 0.9277777777777777 | 0 |
| 0.9284722222222223 | 0 |
| 0.9291666666666667 | 0 |
| 0.9298611111111111 | 0 |
| 0.9305555555555555 | 0 |
| 0.93125 | 0 |
| 0.9319444444444445 | 0 |
| 0.9326388888888889 | 0 |
| 0.9333333333333332 | 0 |
| 0.9340277777777778 | 0 |
| 0.9347222222222222 | 0 |
| 0.9354166666666667 | 0 |
| 0.936111111111111 | 0 |
| 0.9368055555555556 | 0 |
| 0.9375 | 0 |
| 0.9381944444444444 | 0 |
| 0.938888888888889 | 0 |
| 0.9395833333333333 | 0 |
| 0.9402777777777778 | 0 |
| 0.9409722222222222 | 0 |
| 0.9416666666666668 | 0 |
| 0.9423611111111111 | 0 |
| 0.9430555555555555 | 0 |
| 0.94375 | 0 |
| 0.9444444444444445 | 0 |
| 0.9451388888888889 | 0 |
| 0.9458333333333333 | 0 |
| 0.9465277777777777 | 0 |
| 0.9472222222222223 | 0 |
| 0.9479166666666666 | 0 |
| 0.9486111111111111 | 0 |
| 0.9493055555555556 | 0 |
| 0.9500000000000001 | 0 |
| 0.9506944444444444 | 0 |
| 0.9513888888888888 | 0 |
| 0.9520833333333334 | 0 |
| 0.9527777777777778 | 0 |
| 0.9534722222222222 | 0 |
| 0.9541666666666666 | 0 |
| 0.9548611111111112 | 0 |
| 0.9555555555555556 | 0 |
| 0.9562499999999999 | 0 |
| 0.9569444444444444 | 0 |
| 0.9576388888888889 | 0 |
| 0.9583333333333334 | 0 |
| 0.9590277777777777 | 0 |
| 0.9597222222222223 | 0 |
| 0.9604166666666667 | 0 |
| 0.9611111111111111 | 0 |
| 0.9618055555555555 | 0 |
| 0.9625 | 0 |
| 0.9631944444444445 | 0 |
| 0.9638888888888889 | 0 |
| 0.9645833333333332 | 0 |
| 0.9652777777777778 | 0 |
| 0.9659722222222222 | 0 |
| 0.9666666666666667 | 0 |
| 0.967361111111111 | 0 |
| 0.9680555555555556 | 0 |
| 0.96875 | 0 |
| 0.9694444444444444 | 0 |
| 0.970138888888889 | 0 |
| 0.9708333333333333 | 0 |
| 0.9715277777777778 | 0 |
| 0.9722222222222222 | 0 |
| 0.9729166666666668 | 0 |
| 0.9736111111111111 | 0 |
| 0.9743055555555555 | 0 |
| 0.975 | 0 |
| 0.9756944444444445 | 0 |
| 0.9763888888888889 | 0 |
| 0.9770833333333333 | 0 |
| 0.9777777777777777 | 0 |
| 0.9784722222222223 | 0 |
| 0.9791666666666666 | 0 |
| 0.9798611111111111 | 0 |
| 0.9805555555555556 | 0 |
| 0.9812500000000001 | 0 |
| 0.9819444444444444 | 0 |
| 0.9826388888888888 | 0 |
| 0.9833333333333334 | 0 |
| 0.9840277777777778 | 0 |
| 0.9847222222222222 | 0 |
| 0.9854166666666666 | 0 |
| 0.9861111111111112 | 0 |
| 0.9868055555555556 | 0 |
| 0.9874999999999999 | 0 |
| 0.9881944444444444 | 0 |
| 0.9888888888888889 | 0 |
| 0.9895833333333334 | 0 |
| 0.9902777777777777 | 0 |
| 0.9909722222222223 | 0 |
| 0.9916666666666667 | 0 |
| 0.9923611111111111 | 0 |
| 0.9930555555555555 | 0 |
| 0.99375 | 0 |
| 0.9944444444444445 | 0 |
| 0.9951388888888889 | 0 |
| 0.9958333333333332 | 0 |
| 0.9965277777777778 | 0 |
| 0.9972222222222222 | 0 |
| 0.9979166666666667 | 0 |
| 0.998611111111111 | 0 |
| 0.9993055555555556 | 0 |